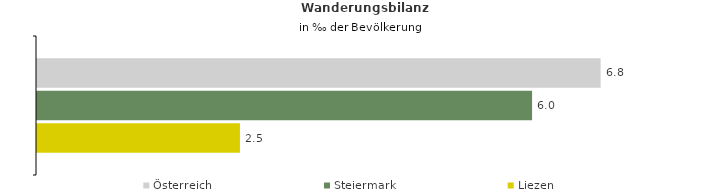
| Category | Österreich | Steiermark | Liezen |
|---|---|---|---|
| Wanderungsrate in ‰ der Bevölkerung, Periode 2018-2022 | 6.822 | 5.992 | 2.456 |